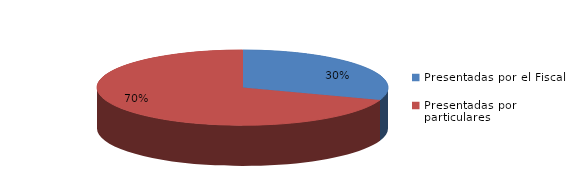
| Category | Series 0 |
|---|---|
| Presentadas por el Fiscal | 200 |
| Presentadas por particulares | 460 |